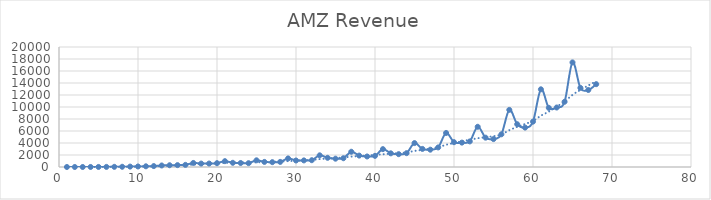
| Category | Revenue |
|---|---|
| 1.0 | 0.511 |
| 2.0 | 0.875 |
| 3.0 | 2.23 |
| 4.0 | 4.173 |
| 5.0 | 8.468 |
| 6.0 | 16.005 |
| 7.0 | 27.855 |
| 8.0 | 37.887 |
| 9.0 | 66.04 |
| 10.0 | 87.361 |
| 11.0 | 115.982 |
| 12.0 | 153.649 |
| 13.0 | 252.893 |
| 14.0 | 293.643 |
| 15.0 | 314.376 |
| 16.0 | 355.778 |
| 17.0 | 676.042 |
| 18.0 | 573.889 |
| 19.0 | 577.876 |
| 20.0 | 637.858 |
| 21.0 | 972.36 |
| 22.0 | 700.356 |
| 23.0 | 667.625 |
| 24.0 | 639.281 |
| 25.0 | 1115.171 |
| 26.0 | 847.422 |
| 27.0 | 805.605 |
| 28.0 | 851.299 |
| 29.0 | 1428.61 |
| 30.0 | 1083.559 |
| 31.0 | 1099.912 |
| 32.0 | 1134.456 |
| 33.0 | 1945.772 |
| 34.0 | 1530.349 |
| 35.0 | 1387.341 |
| 36.0 | 1462.475 |
| 37.0 | 2540.959 |
| 38.0 | 1902 |
| 39.0 | 1753 |
| 40.0 | 1858 |
| 41.0 | 2977 |
| 42.0 | 2279 |
| 43.0 | 2139 |
| 44.0 | 2307 |
| 45.0 | 3986 |
| 46.0 | 3015 |
| 47.0 | 2886 |
| 48.0 | 3262 |
| 49.0 | 5672 |
| 50.0 | 4135 |
| 51.0 | 4063 |
| 52.0 | 4265 |
| 53.0 | 6703 |
| 54.0 | 4889 |
| 55.0 | 4652 |
| 56.0 | 5448 |
| 57.0 | 9520 |
| 58.0 | 7131 |
| 59.0 | 6566 |
| 60.0 | 7560 |
| 61.0 | 12948 |
| 62.0 | 9857 |
| 63.0 | 9913 |
| 64.0 | 10876 |
| 65.0 | 17431 |
| 66.0 | 13185 |
| 67.0 | 12834 |
| 68.0 | 13805 |